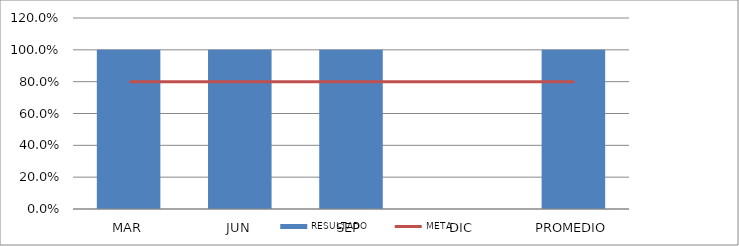
| Category | RESULTADO |
|---|---|
| MAR | 1 |
| JUN | 1 |
| SEP | 1 |
| DIC | 0 |
| PROMEDIO | 1 |